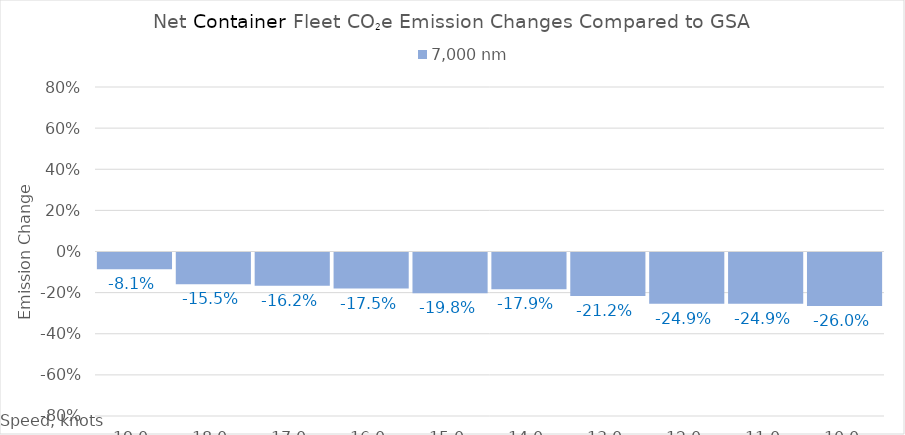
| Category | 7,000 |
|---|---|
| 19.0 | -0.081 |
| 18.0 | -0.155 |
| 17.0 | -0.162 |
| 16.0 | -0.175 |
| 15.0 | -0.198 |
| 14.0 | -0.179 |
| 13.0 | -0.212 |
| 12.0 | -0.249 |
| 11.0 | -0.249 |
| 10.0 | -0.26 |